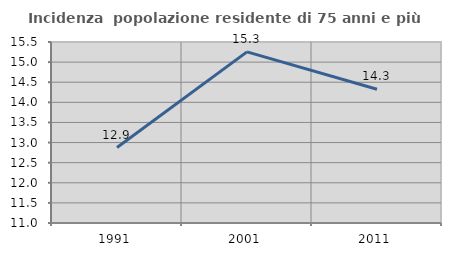
| Category | Incidenza  popolazione residente di 75 anni e più |
|---|---|
| 1991.0 | 12.876 |
| 2001.0 | 15.254 |
| 2011.0 | 14.324 |